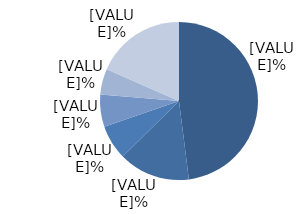
| Category | Bărbați |
|---|---|
| Bolile aparatului circulator | 48 |
| Tumori maligne | 14.6 |
| Bolile aparatului digestiv | 7.1 |
| Bolile aparatului respirator | 6.6 |
| Accidente, intoxicaţii şi traumatisme | 5.3 |
| Alte cauze  | 18.4 |